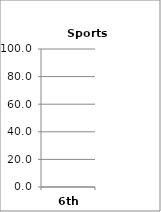
| Category | Sports (Choices) |
|---|---|
| 6th | 0 |